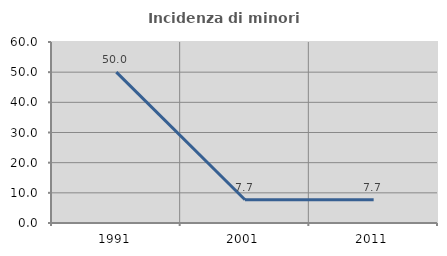
| Category | Incidenza di minori stranieri |
|---|---|
| 1991.0 | 50 |
| 2001.0 | 7.692 |
| 2011.0 | 7.692 |